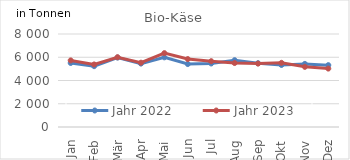
| Category | Jahr 2022 | Jahr 2023 |
|---|---|---|
| Jan | 5506.883 | 5728.184 |
| Feb | 5232.714 | 5379.243 |
| Mär | 5971.301 | 6002.91 |
| Apr | 5454.565 | 5531.688 |
| Mai | 5992.187 | 6354.109 |
| Jun | 5414.064 | 5844.272 |
| Jul | 5464.028 | 5659.492 |
| Aug | 5748.173 | 5502.916 |
| Sep | 5490.28 | 5452.746 |
| Okt | 5335.636 | 5520.432 |
| Nov | 5427.973 | 5174.682 |
| Dez | 5321.062 | 5025.897 |